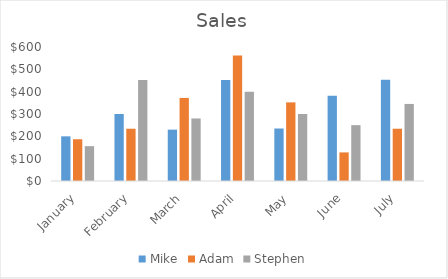
| Category | Mike | Adam | Stephen |
|---|---|---|---|
| January | 200 | 187 | 156 |
| February | 300 | 234 | 452 |
| March | 230 | 372 | 280 |
| April | 452 | 562 | 400 |
| May | 235 | 352 | 300 |
| June | 382 | 128 | 250 |
| July | 453 | 234 | 345 |